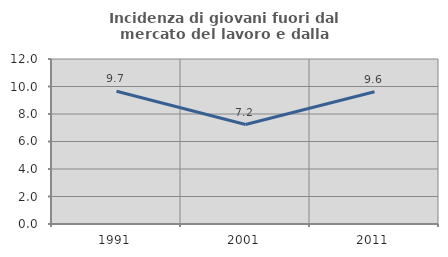
| Category | Incidenza di giovani fuori dal mercato del lavoro e dalla formazione  |
|---|---|
| 1991.0 | 9.654 |
| 2001.0 | 7.232 |
| 2011.0 | 9.613 |